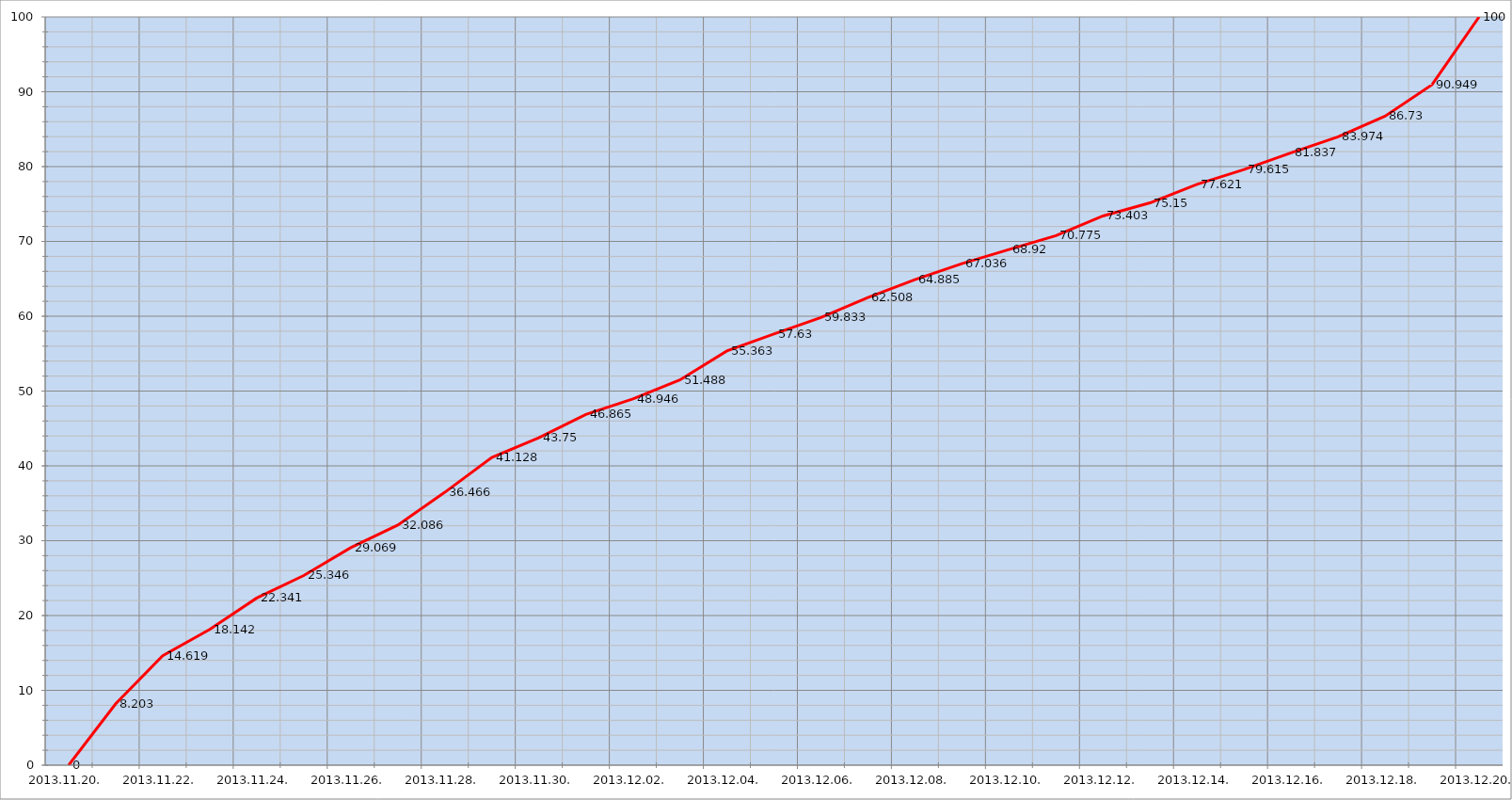
| Category | Szerver 6 |
|---|---|
| 2013-11-20 | 0 |
| 2013-11-21 | 8.203 |
| 2013-11-22 | 14.619 |
| 2013-11-23 | 18.142 |
| 2013-11-24 | 22.341 |
| 2013-11-25 | 25.346 |
| 2013-11-26 | 29.069 |
| 2013-11-27 | 32.086 |
| 2013-11-28 | 36.466 |
| 2013-11-29 | 41.128 |
| 2013-11-30 | 43.75 |
| 2013-12-01 | 46.865 |
| 2013-12-02 | 48.946 |
| 2013-12-03 | 51.488 |
| 2013-12-04 | 55.363 |
| 2013-12-05 | 57.63 |
| 2013-12-06 | 59.833 |
| 2013-12-07 | 62.508 |
| 2013-12-08 | 64.885 |
| 2013-12-09 | 67.036 |
| 2013-12-10 | 68.92 |
| 2013-12-11 | 70.775 |
| 2013-12-12 | 73.403 |
| 2013-12-13 | 75.15 |
| 2013-12-14 | 77.621 |
| 2013-12-15 | 79.615 |
| 2013-12-16 | 81.837 |
| 2013-12-17 | 83.974 |
| 2013-12-18 | 86.73 |
| 2013-12-19 | 90.949 |
| 2013-12-20 | 100 |